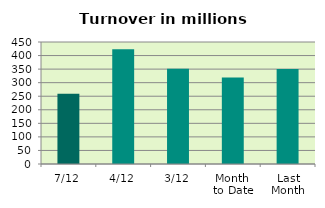
| Category | Series 0 |
|---|---|
| 7/12 | 258.773 |
| 4/12 | 423.529 |
| 3/12 | 351.557 |
| Month 
to Date | 318.741 |
| Last
Month | 350.651 |